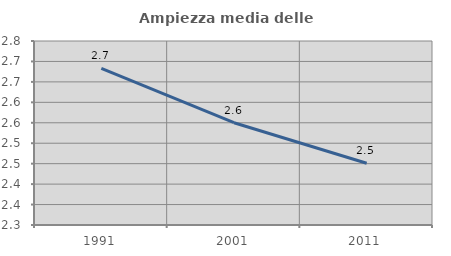
| Category | Ampiezza media delle famiglie |
|---|---|
| 1991.0 | 2.683 |
| 2001.0 | 2.55 |
| 2011.0 | 2.451 |